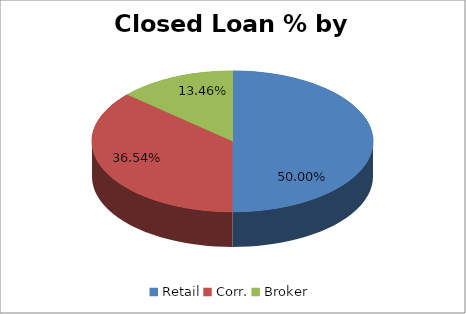
| Category | Closed Loan % (Current Month) |
|---|---|
| Retail | 0.5 |
| Corr. | 0.365 |
| Broker | 0.135 |